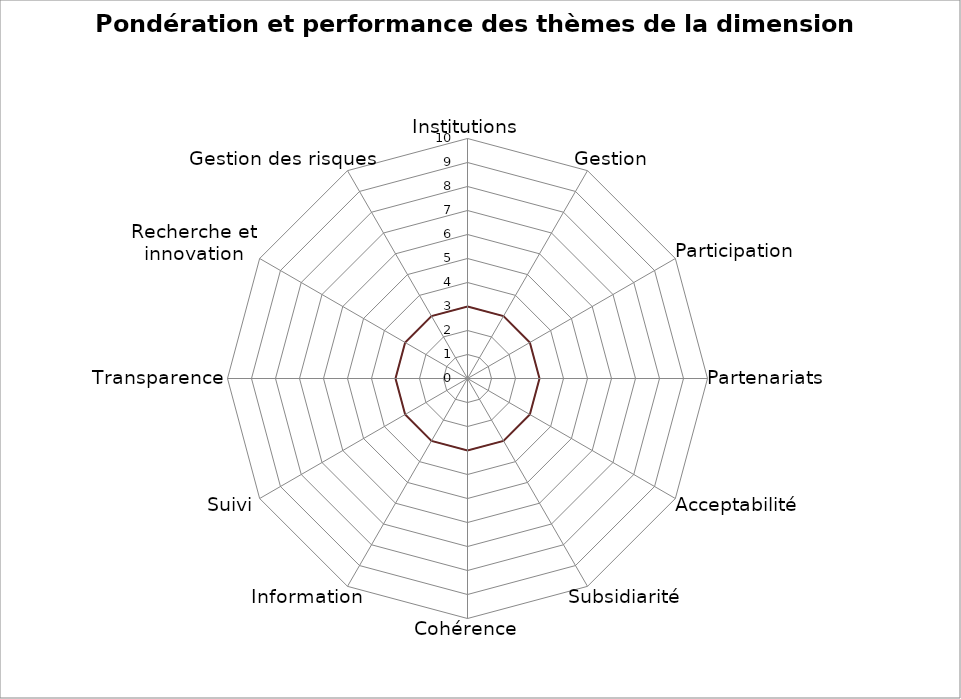
| Category | Performance | Pondération | Series 2 |
|---|---|---|---|
| Institutions | 0 | 0 | 3 |
| Gestion | 0 | 0 | 3 |
| Participation | 0 | 0 | 3 |
| Partenariats | 0 | 0 | 3 |
| Acceptabilité | 0 | 0 | 3 |
| Subsidiarité | 0 | 0 | 3 |
| Cohérence | 0 | 0 | 3 |
| Information | 0 | 0 | 3 |
| Suivi | 0 | 0 | 3 |
| Transparence | 0 | 0 | 3 |
| Recherche et innovation | 0 | 0 | 3 |
| Gestion des risques | 0 | 0 | 3 |